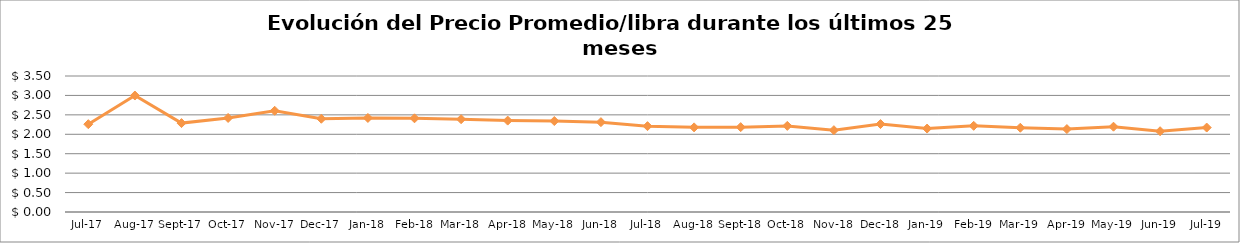
| Category | Series 0 |
|---|---|
| 2017-07-01 | 2.26 |
| 2017-08-01 | 2.997 |
| 2017-09-01 | 2.288 |
| 2017-10-01 | 2.421 |
| 2017-11-01 | 2.605 |
| 2017-12-01 | 2.4 |
| 2018-01-01 | 2.42 |
| 2018-02-01 | 2.412 |
| 2018-03-01 | 2.388 |
| 2018-04-01 | 2.352 |
| 2018-05-01 | 2.341 |
| 2018-06-01 | 2.312 |
| 2018-07-01 | 2.209 |
| 2018-08-01 | 2.178 |
| 2018-09-01 | 2.184 |
| 2018-10-01 | 2.216 |
| 2018-11-01 | 2.106 |
| 2018-12-01 | 2.264 |
| 2019-01-01 | 2.147 |
| 2019-02-01 | 2.218 |
| 2019-03-01 | 2.169 |
| 2019-04-01 | 2.134 |
| 2019-05-01 | 2.195 |
| 2019-06-01 | 2.079 |
| 2019-07-01 | 2.173 |